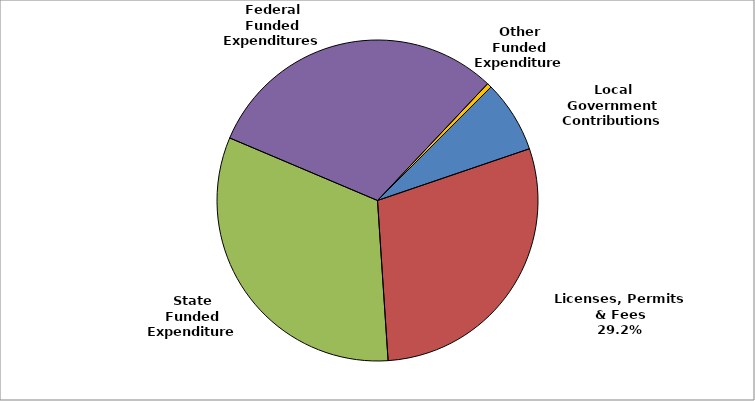
| Category | Series 0 |
|---|---|
| Local Government Contributions | 0.073 |
| Licenses, Permits & Fees | 0.292 |
| State Funded Expenditures | 0.324 |
| Federal Funded Expenditures | 0.307 |
| Other Funded Expenditures | 0.005 |